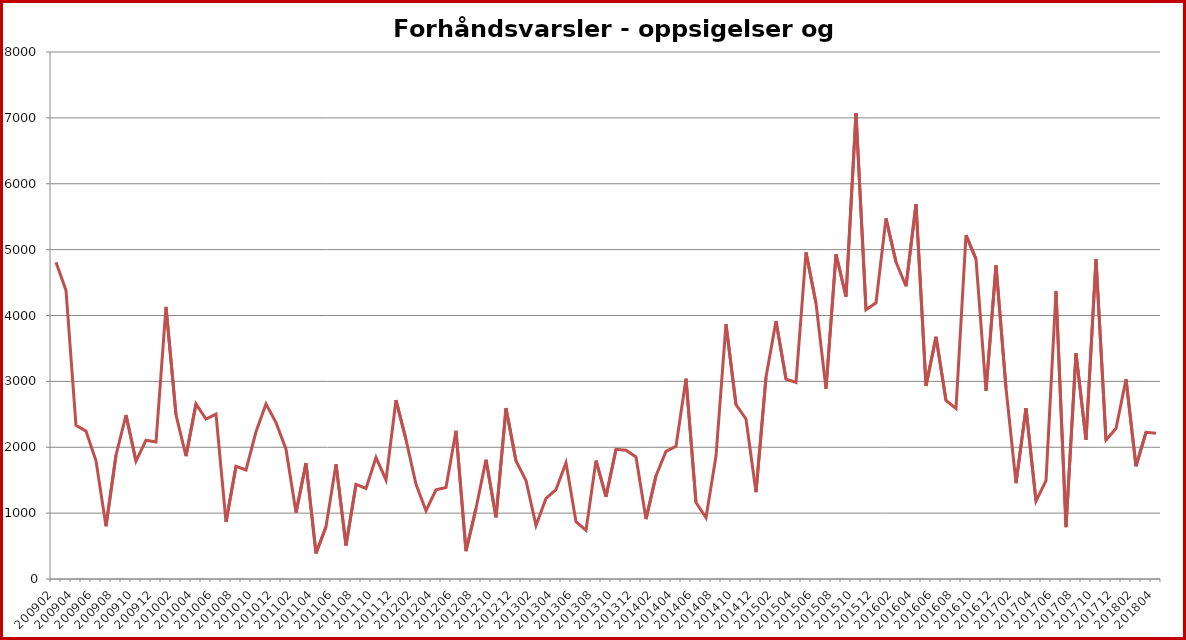
| Category | Series 1 |
|---|---|
| 200902.0 | 4810 |
| 200903.0 | 4381 |
| 200904.0 | 2332 |
| 200905.0 | 2245 |
| 200906.0 | 1794 |
| 200907.0 | 802 |
| 200908.0 | 1879 |
| 200909.0 | 2489 |
| 200910.0 | 1789 |
| 200911.0 | 2107 |
| 200912.0 | 2080 |
| 201001.0 | 4130 |
| 201002.0 | 2490 |
| 201003.0 | 1865 |
| 201004.0 | 2658 |
| 201005.0 | 2427 |
| 201006.0 | 2503 |
| 201007.0 | 866 |
| 201008.0 | 1711 |
| 201009.0 | 1655 |
| 201010.0 | 2235 |
| 201011.0 | 2658 |
| 201012.0 | 2374 |
| 201101.0 | 1971 |
| 201102.0 | 1008 |
| 201103.0 | 1759 |
| 201104.0 | 389 |
| 201105.0 | 794 |
| 201106.0 | 1744 |
| 201107.0 | 509 |
| 201108.0 | 1436 |
| 201109.0 | 1374 |
| 201110.0 | 1844 |
| 201111.0 | 1504 |
| 201112.0 | 2714 |
| 201201.0 | 2115 |
| 201202.0 | 1437 |
| 201203.0 | 1037 |
| 201204.0 | 1355 |
| 201205.0 | 1390 |
| 201206.0 | 2249 |
| 201207.0 | 423 |
| 201208.0 | 1073 |
| 201209.0 | 1812 |
| 201210.0 | 937 |
| 201211.0 | 2594 |
| 201212.0 | 1792 |
| 201301.0 | 1496 |
| 201302.0 | 813 |
| 201303.0 | 1223 |
| 201304.0 | 1358 |
| 201305.0 | 1765 |
| 201306.0 | 869 |
| 201307.0 | 738 |
| 201308.0 | 1797 |
| 201309.0 | 1250 |
| 201310.0 | 1969 |
| 201311.0 | 1954 |
| 201312.0 | 1853 |
| 201401.0 | 910 |
| 201402.0 | 1568 |
| 201403.0 | 1937 |
| 201404.0 | 2014 |
| 201405.0 | 3040 |
| 201406.0 | 1160 |
| 201407.0 | 929 |
| 201408.0 | 1866 |
| 201409.0 | 3868 |
| 201410.0 | 2646 |
| 201411.0 | 2429 |
| 201412.0 | 1317 |
| 201501.0 | 3062 |
| 201502.0 | 3915 |
| 201503.0 | 3035 |
| 201504.0 | 2985 |
| 201505.0 | 4960 |
| 201506.0 | 4185 |
| 201507.0 | 2888 |
| 201508.0 | 4930 |
| 201509.0 | 4286 |
| 201510.0 | 7072 |
| 201511.0 | 4087 |
| 201512.0 | 4193 |
| 201601.0 | 5475 |
| 201602.0 | 4812 |
| 201603.0 | 4444 |
| 201604.0 | 5691 |
| 201605.0 | 2931 |
| 201606.0 | 3676 |
| 201607.0 | 2709 |
| 201608.0 | 2588 |
| 201609.0 | 5220 |
| 201610.0 | 4857 |
| 201611.0 | 2855 |
| 201612.0 | 4761 |
| 201701.0 | 2898 |
| 201702.0 | 1454 |
| 201703.0 | 2594 |
| 201704.0 | 1182 |
| 201705.0 | 1494 |
| 201706.0 | 4368 |
| 201707.0 | 787 |
| 201708.0 | 3429 |
| 201709.0 | 2112 |
| 201710.0 | 4854 |
| 201711.0 | 2109 |
| 201712.0 | 2284 |
| 201801.0 | 3032 |
| 201802.0 | 1711 |
| 201803.0 | 2227 |
| 201804.0 | 2213 |